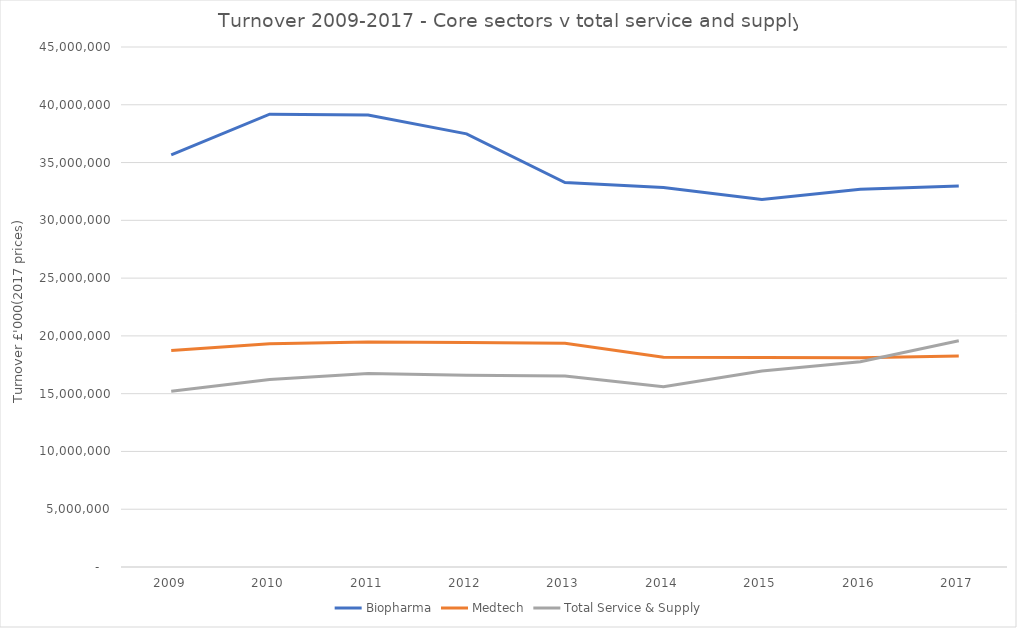
| Category | Biopharma | Medtech | Total Service & Supply |
|---|---|---|---|
| 2009 | 35674213 | 18725695 | 15200553 |
| 2010 | 39186617 | 19311957 | 16230374 |
| 2011 | 39115172 | 19478081 | 16748553 |
| 2012 | 37483753 | 19437837 | 16599500 |
| 2013 | 33276392 | 19372019 | 16536705 |
| 2014 | 32833785 | 18142369 | 15602170 |
| 2015 | 31797264 | 18123877 | 16955439 |
| 2016 | 32698429 | 18105015 | 17761154 |
| 2017 | 32968443 | 18261551 | 19580778 |